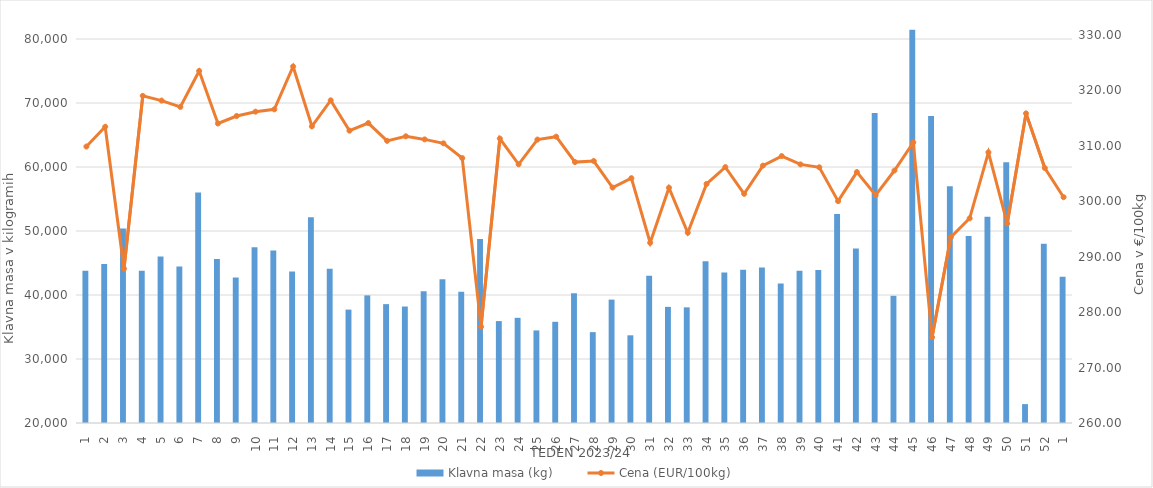
| Category | Klavna masa (kg) |
|---|---|
| 1.0 | 43807 |
| 2.0 | 44834 |
| 3.0 | 50386 |
| 4.0 | 43773 |
| 5.0 | 46011 |
| 6.0 | 44439 |
| 7.0 | 56001 |
| 8.0 | 45613 |
| 9.0 | 42730 |
| 10.0 | 47471 |
| 11.0 | 46952 |
| 12.0 | 43683 |
| 13.0 | 52135 |
| 14.0 | 44103 |
| 15.0 | 37719 |
| 16.0 | 39943 |
| 17.0 | 38574 |
| 18.0 | 38200 |
| 19.0 | 40581 |
| 20.0 | 42443 |
| 21.0 | 40517 |
| 22.0 | 48742 |
| 23.0 | 35927 |
| 24.0 | 36436 |
| 25.0 | 34463 |
| 26.0 | 35812 |
| 27.0 | 40280 |
| 28.0 | 34201 |
| 29.0 | 39279 |
| 30.0 | 33702 |
| 31.0 | 43020 |
| 32.0 | 38146 |
| 33.0 | 38070 |
| 34.0 | 45290 |
| 35.0 | 43513 |
| 36.0 | 43945 |
| 37.0 | 44302 |
| 38.0 | 41798 |
| 39.0 | 43790 |
| 40.0 | 43913 |
| 41.0 | 52663 |
| 42.0 | 47275 |
| 43.0 | 68419 |
| 44.0 | 39872 |
| 45.0 | 81439 |
| 46.0 | 67983 |
| 47.0 | 57006 |
| 48.0 | 49204 |
| 49.0 | 52219 |
| 50.0 | 60759 |
| 51.0 | 22954 |
| 52.0 | 48002 |
| 1.0 | 42866 |